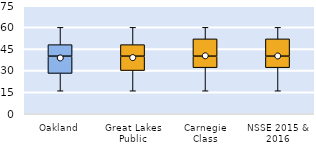
| Category | 25th | 50th | 75th |
|---|---|---|---|
| Oakland | 28 | 12 | 8 |
| Great Lakes Public | 30 | 10 | 8 |
| Carnegie Class | 32 | 8 | 12 |
| NSSE 2015 & 2016 | 32 | 8 | 12 |